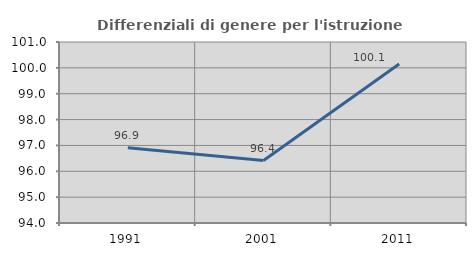
| Category | Differenziali di genere per l'istruzione superiore |
|---|---|
| 1991.0 | 96.911 |
| 2001.0 | 96.415 |
| 2011.0 | 100.146 |